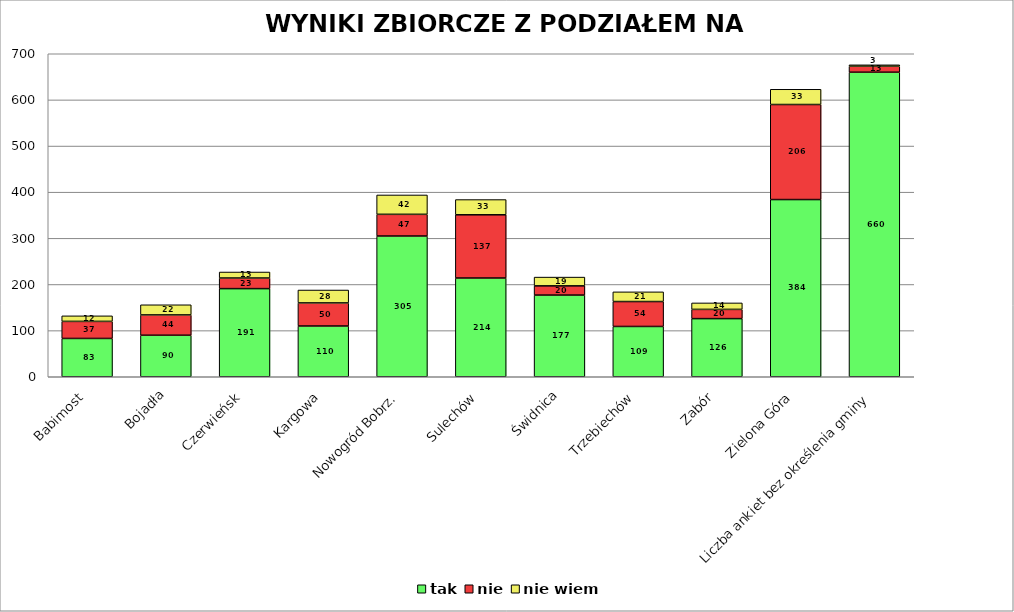
| Category | tak | nie | nie wiem |
|---|---|---|---|
| Babimost | 83 | 37 | 12 |
| Bojadła | 90 | 44 | 22 |
| Czerwieńsk | 191 | 23 | 13 |
| Kargowa | 110 | 50 | 28 |
| Nowogród Bobrz. | 305 | 47 | 42 |
| Sulechów | 214 | 137 | 33 |
| Świdnica | 177 | 20 | 19 |
| Trzebiechów | 109 | 54 | 21 |
| Zabór | 126 | 20 | 14 |
| Zielona Góra | 384 | 206 | 33 |
| Liczba ankiet bez określenia gminy | 660 | 13 | 3 |